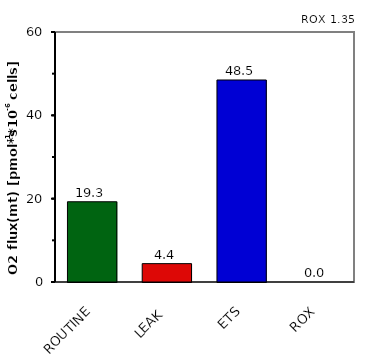
| Category | ROX 1,35 |
|---|---|
| ROUTINE | 19.26 |
| LEAK | 4.408 |
| ETS | 48.482 |
| ROX | 0 |